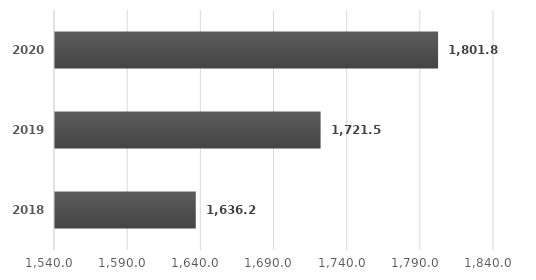
| Category | Series 0 |
|---|---|
| 2018.0 | 1636.2 |
| 2019.0 | 1721.5 |
| 2020.0 | 1801.8 |